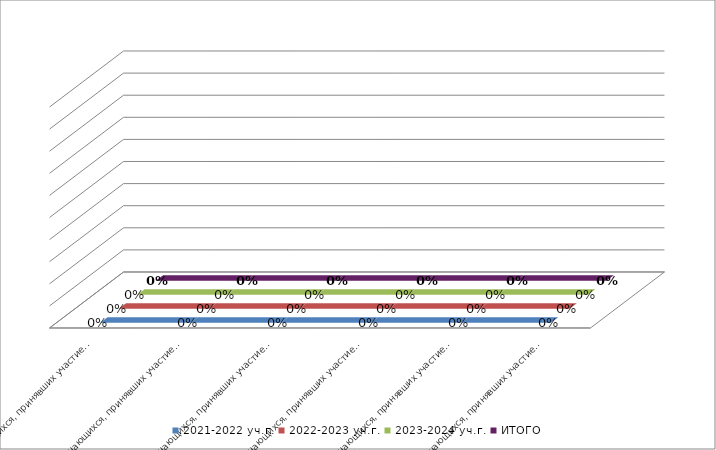
| Category | 2021-2022 уч.г. | 2022-2023 уч.г. | 2023-2024 уч.г. | ИТОГО |
|---|---|---|---|---|
| Доля обучающихся, принявших участие в сессиях профессионального ознакомления на базе ОО (суммарно) | 0 | 0 | 0 | 0 |
| Доля обучающихся, принявших участие в сессиях профессионального ознакомления на территории организаций-партнёров (суммарно) | 0 | 0 | 0 | 0 |
| Доля обучающихся, принявших участие в профессиональных пробах на базе ОО (суммарно) | 0 | 0 | 0 | 0 |
| Доля обучающихся, принявших участие в профессиональных пробах на территории организации-партнёра (суммарно) | 0 | 0 | 0 | 0 |
| Доля обучающихся, принявших участие в профориентационных мероприятиях, проведённых по инициативе членов Клуба выпускников | 0 | 0 | 0 | 0 |
| Доля обучающихся, принявших участие в профориентационных конкурсах  | 0 | 0 | 0 | 0 |